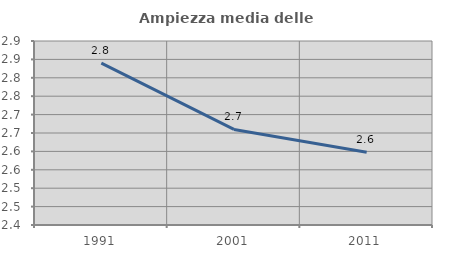
| Category | Ampiezza media delle famiglie |
|---|---|
| 1991.0 | 2.84 |
| 2001.0 | 2.66 |
| 2011.0 | 2.597 |